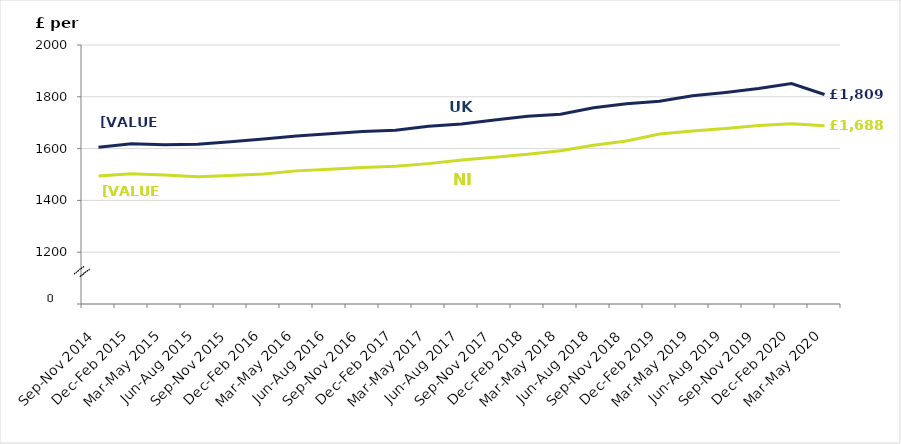
| Category | NI | UK |
|---|---|---|
| Sep-Nov 2014 | 1494 | 1605 |
| Dec-Feb 2015 | 1503 | 1619 |
| Mar-May 2015 | 1498 | 1615 |
| Jun-Aug 2015 | 1491 | 1617 |
| Sep-Nov 2015 | 1496 | 1626 |
| Dec-Feb 2016 | 1502 | 1637 |
| Mar-May 2016 | 1514 | 1649 |
| Jun-Aug 2016 | 1520 | 1657 |
| Sep-Nov 2016 | 1527 | 1666 |
| Dec-Feb 2017 | 1532 | 1671 |
| Mar-May 2017 | 1542 | 1686 |
| Jun-Aug 2017 | 1556 | 1695 |
| Sep-Nov 2017 | 1567 | 1710 |
| Dec-Feb 2018 | 1578 | 1725 |
| Mar-May 2018 | 1592 | 1733 |
| Jun-Aug 2018 | 1613 | 1758 |
| Sep-Nov 2018 | 1629 | 1773 |
| Dec-Feb 2019 | 1656 | 1783 |
| Mar-May 2019 | 1668 | 1804 |
| Jun-Aug 2019 | 1678 | 1817 |
| Sep-Nov 2019 | 1689 | 1832 |
| Dec-Feb 2020 | 1696 | 1851 |
| Mar-May 2020 | 1688 | 1809 |